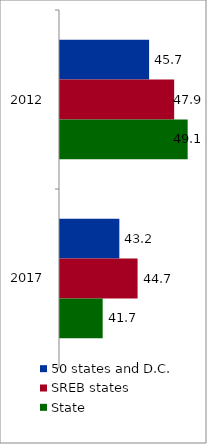
| Category | 50 states and D.C. | SREB states | State |
|---|---|---|---|
| 2012.0 | 45.748 | 47.928 | 49.101 |
| 2017.0 | 43.161 | 44.746 | 41.711 |